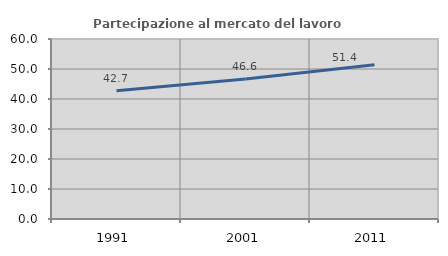
| Category | Partecipazione al mercato del lavoro  femminile |
|---|---|
| 1991.0 | 42.749 |
| 2001.0 | 46.635 |
| 2011.0 | 51.402 |